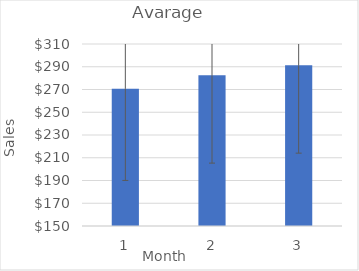
| Category | Series 0 |
|---|---|
| 0 | 270.625 |
| 1 | 282.5 |
| 2 | 291.25 |